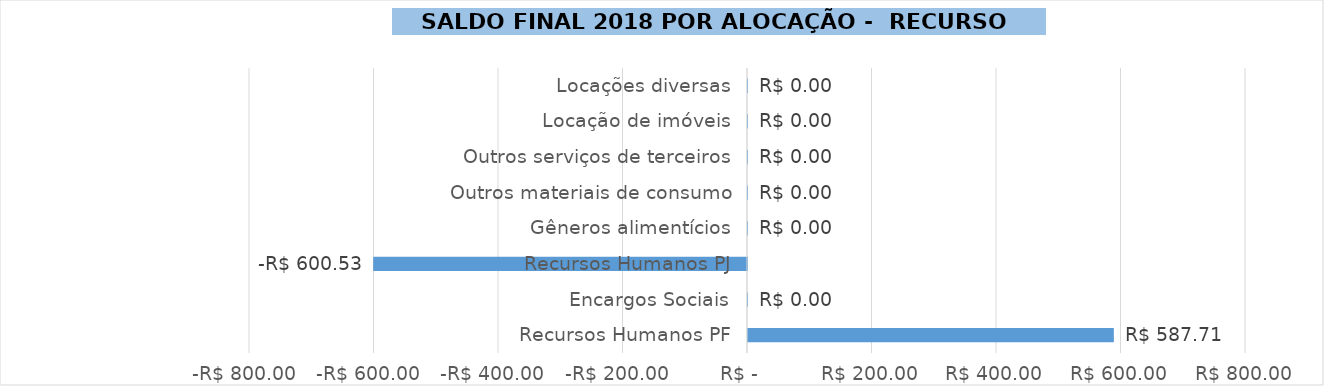
| Category | Saldo Final 2018 |
|---|---|
| Recursos Humanos PF | 587.712 |
| Encargos Sociais | 0 |
| Recursos Humanos PJ | -600.532 |
| Gêneros alimentícios | 0 |
| Outros materiais de consumo | 0 |
| Outros serviços de terceiros | 0 |
| Locação de imóveis | 0 |
| Locações diversas | 0 |